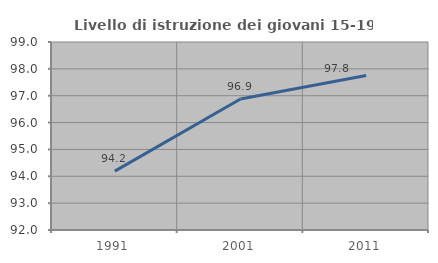
| Category | Livello di istruzione dei giovani 15-19 anni |
|---|---|
| 1991.0 | 94.192 |
| 2001.0 | 96.875 |
| 2011.0 | 97.756 |